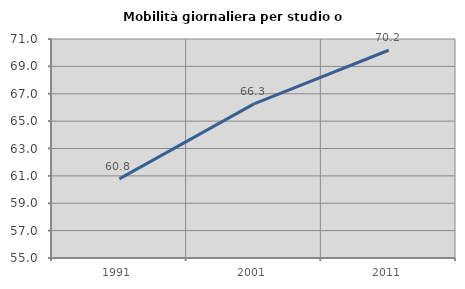
| Category | Mobilità giornaliera per studio o lavoro |
|---|---|
| 1991.0 | 60.784 |
| 2001.0 | 66.256 |
| 2011.0 | 70.177 |